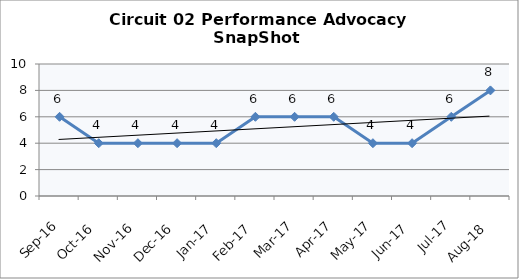
| Category | Circuit 02 |
|---|---|
| Sep-16 | 6 |
| Oct-16 | 4 |
| Nov-16 | 4 |
| Dec-16 | 4 |
| Jan-17 | 4 |
| Feb-17 | 6 |
| Mar-17 | 6 |
| Apr-17 | 6 |
| May-17 | 4 |
| Jun-17 | 4 |
| Jul-17 | 6 |
| Aug-18 | 8 |